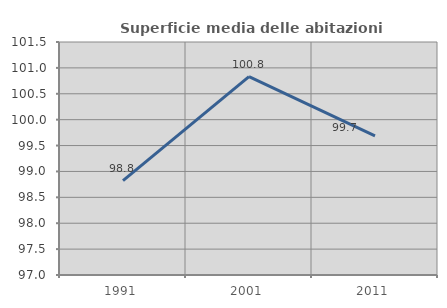
| Category | Superficie media delle abitazioni occupate |
|---|---|
| 1991.0 | 98.822 |
| 2001.0 | 100.831 |
| 2011.0 | 99.685 |